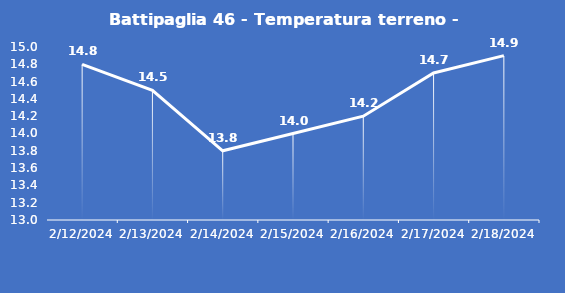
| Category | Battipaglia 46 - Temperatura terreno - Max (°C) |
|---|---|
| 2/12/24 | 14.8 |
| 2/13/24 | 14.5 |
| 2/14/24 | 13.8 |
| 2/15/24 | 14 |
| 2/16/24 | 14.2 |
| 2/17/24 | 14.7 |
| 2/18/24 | 14.9 |